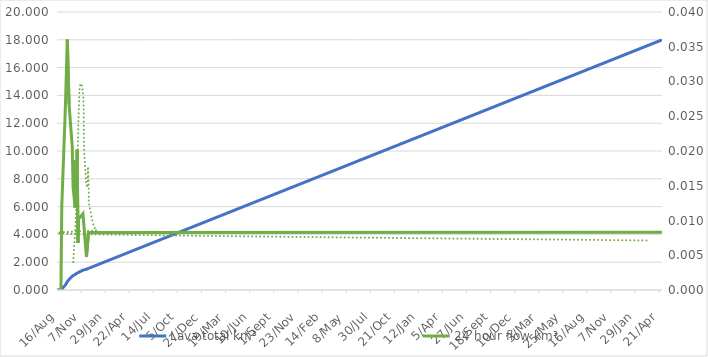
| Category | Lava total km³ |
|---|---|
| 2014-08-16 | 0 |
| 2014-08-29 | 0 |
| 2014-09-01 | 0.036 |
| 2014-09-13 | 0.346 |
| 2014-09-20 | 0.599 |
| 2014-09-26 | 0.759 |
| 2014-10-07 | 0.986 |
| 2014-10-10 | 1.031 |
| 2014-10-17 | 1.113 |
| 2014-10-19 | 1.151 |
| 2014-10-23 | 1.208 |
| 2014-10-24 | 1.228 |
| 2014-10-27 | 1.249 |
| 2014-10-28 | 1.259 |
| 2014-11-13 | 1.434 |
| 2014-11-25 | 1.492 |
| 2014-12-02 | 1.549 |
| 2020-04-30 | 17.997 |